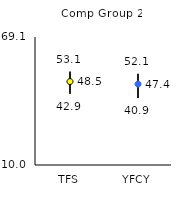
| Category | 25th | 75th | Mean |
|---|---|---|---|
| TFS | 42.9 | 53.1 | 48.53 |
| YFCY | 40.9 | 52.1 | 47.35 |